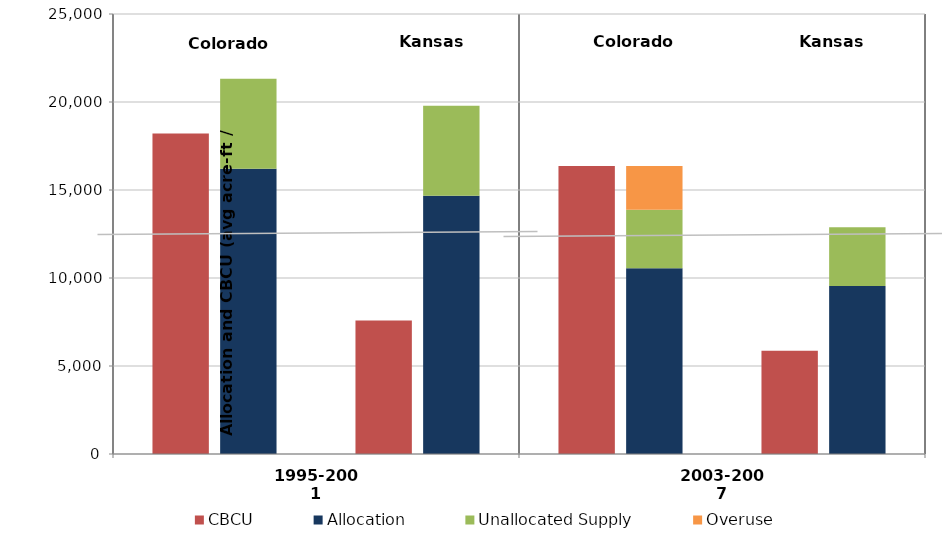
| Category | Axis |
|---|---|
| 1995-2001 | 0 |
| 2003-2007 | 0 |